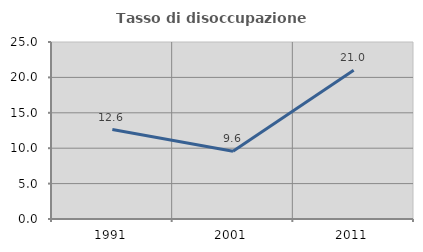
| Category | Tasso di disoccupazione giovanile  |
|---|---|
| 1991.0 | 12.632 |
| 2001.0 | 9.565 |
| 2011.0 | 21 |